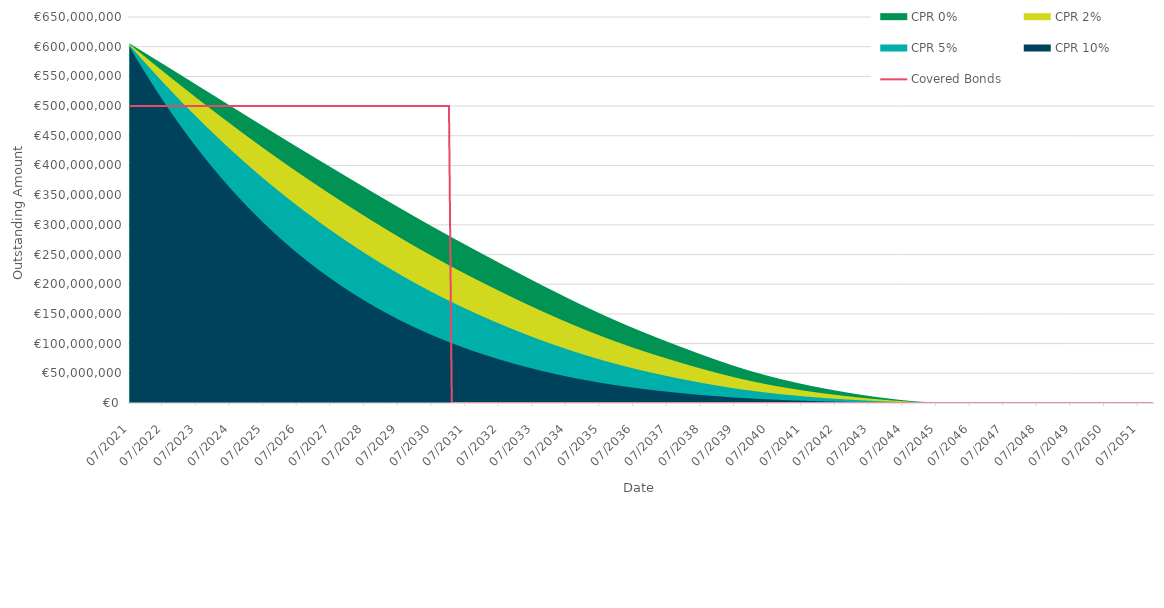
| Category | Covered Bonds |
|---|---|
| 2021-07-31 | 500000000 |
| 2021-08-31 | 500000000 |
| 2021-09-30 | 500000000 |
| 2021-10-31 | 500000000 |
| 2021-11-30 | 500000000 |
| 2021-12-31 | 500000000 |
| 2022-01-31 | 500000000 |
| 2022-02-28 | 500000000 |
| 2022-03-31 | 500000000 |
| 2022-04-30 | 500000000 |
| 2022-05-31 | 500000000 |
| 2022-06-30 | 500000000 |
| 2022-07-31 | 500000000 |
| 2022-08-31 | 500000000 |
| 2022-09-30 | 500000000 |
| 2022-10-31 | 500000000 |
| 2022-11-30 | 500000000 |
| 2022-12-31 | 500000000 |
| 2023-01-31 | 500000000 |
| 2023-02-28 | 500000000 |
| 2023-03-31 | 500000000 |
| 2023-04-30 | 500000000 |
| 2023-05-31 | 500000000 |
| 2023-06-30 | 500000000 |
| 2023-07-31 | 500000000 |
| 2023-08-31 | 500000000 |
| 2023-09-30 | 500000000 |
| 2023-10-31 | 500000000 |
| 2023-11-30 | 500000000 |
| 2023-12-31 | 500000000 |
| 2024-01-31 | 500000000 |
| 2024-02-29 | 500000000 |
| 2024-03-31 | 500000000 |
| 2024-04-30 | 500000000 |
| 2024-05-31 | 500000000 |
| 2024-06-30 | 500000000 |
| 2024-07-31 | 500000000 |
| 2024-08-31 | 500000000 |
| 2024-09-30 | 500000000 |
| 2024-10-31 | 500000000 |
| 2024-11-30 | 500000000 |
| 2024-12-31 | 500000000 |
| 2025-01-31 | 500000000 |
| 2025-02-28 | 500000000 |
| 2025-03-31 | 500000000 |
| 2025-04-30 | 500000000 |
| 2025-05-31 | 500000000 |
| 2025-06-30 | 500000000 |
| 2025-07-31 | 500000000 |
| 2025-08-31 | 500000000 |
| 2025-09-30 | 500000000 |
| 2025-10-31 | 500000000 |
| 2025-11-30 | 500000000 |
| 2025-12-31 | 500000000 |
| 2026-01-31 | 500000000 |
| 2026-02-28 | 500000000 |
| 2026-03-31 | 500000000 |
| 2026-04-30 | 500000000 |
| 2026-05-31 | 500000000 |
| 2026-06-30 | 500000000 |
| 2026-07-31 | 500000000 |
| 2026-08-31 | 500000000 |
| 2026-09-30 | 500000000 |
| 2026-10-31 | 500000000 |
| 2026-11-30 | 500000000 |
| 2026-12-31 | 500000000 |
| 2027-01-31 | 500000000 |
| 2027-02-28 | 500000000 |
| 2027-03-31 | 500000000 |
| 2027-04-30 | 500000000 |
| 2027-05-31 | 500000000 |
| 2027-06-30 | 500000000 |
| 2027-07-31 | 500000000 |
| 2027-08-31 | 500000000 |
| 2027-09-30 | 500000000 |
| 2027-10-31 | 500000000 |
| 2027-11-30 | 500000000 |
| 2027-12-31 | 500000000 |
| 2028-01-31 | 500000000 |
| 2028-02-29 | 500000000 |
| 2028-03-31 | 500000000 |
| 2028-04-30 | 500000000 |
| 2028-05-31 | 500000000 |
| 2028-06-30 | 500000000 |
| 2028-07-31 | 500000000 |
| 2028-08-31 | 500000000 |
| 2028-09-30 | 500000000 |
| 2028-10-31 | 500000000 |
| 2028-11-30 | 500000000 |
| 2028-12-31 | 500000000 |
| 2029-01-31 | 500000000 |
| 2029-02-28 | 500000000 |
| 2029-03-31 | 500000000 |
| 2029-04-30 | 500000000 |
| 2029-05-31 | 500000000 |
| 2029-06-30 | 500000000 |
| 2029-07-31 | 500000000 |
| 2029-08-31 | 500000000 |
| 2029-09-30 | 500000000 |
| 2029-10-31 | 500000000 |
| 2029-11-30 | 500000000 |
| 2029-12-31 | 500000000 |
| 2030-01-31 | 500000000 |
| 2030-02-28 | 500000000 |
| 2030-03-31 | 500000000 |
| 2030-04-30 | 500000000 |
| 2030-05-31 | 500000000 |
| 2030-06-30 | 500000000 |
| 2030-07-31 | 500000000 |
| 2030-08-31 | 500000000 |
| 2030-09-30 | 500000000 |
| 2030-10-31 | 500000000 |
| 2030-11-30 | 500000000 |
| 2030-12-31 | 500000000 |
| 2031-01-31 | 500000000 |
| 2031-02-28 | 0 |
| 2031-03-31 | 0 |
| 2031-04-30 | 0 |
| 2031-05-31 | 0 |
| 2031-06-30 | 0 |
| 2031-07-31 | 0 |
| 2031-08-31 | 0 |
| 2031-09-30 | 0 |
| 2031-10-31 | 0 |
| 2031-11-30 | 0 |
| 2031-12-31 | 0 |
| 2032-01-31 | 0 |
| 2032-02-29 | 0 |
| 2032-03-31 | 0 |
| 2032-04-30 | 0 |
| 2032-05-31 | 0 |
| 2032-06-30 | 0 |
| 2032-07-31 | 0 |
| 2032-08-31 | 0 |
| 2032-09-30 | 0 |
| 2032-10-31 | 0 |
| 2032-11-30 | 0 |
| 2032-12-31 | 0 |
| 2033-01-31 | 0 |
| 2033-02-28 | 0 |
| 2033-03-31 | 0 |
| 2033-04-30 | 0 |
| 2033-05-31 | 0 |
| 2033-06-30 | 0 |
| 2033-07-31 | 0 |
| 2033-08-31 | 0 |
| 2033-09-30 | 0 |
| 2033-10-31 | 0 |
| 2033-11-30 | 0 |
| 2033-12-31 | 0 |
| 2034-01-31 | 0 |
| 2034-02-28 | 0 |
| 2034-03-31 | 0 |
| 2034-04-30 | 0 |
| 2034-05-31 | 0 |
| 2034-06-30 | 0 |
| 2034-07-31 | 0 |
| 2034-08-31 | 0 |
| 2034-09-30 | 0 |
| 2034-10-31 | 0 |
| 2034-11-30 | 0 |
| 2034-12-31 | 0 |
| 2035-01-31 | 0 |
| 2035-02-28 | 0 |
| 2035-03-31 | 0 |
| 2035-04-30 | 0 |
| 2035-05-31 | 0 |
| 2035-06-30 | 0 |
| 2035-07-31 | 0 |
| 2035-08-31 | 0 |
| 2035-09-30 | 0 |
| 2035-10-31 | 0 |
| 2035-11-30 | 0 |
| 2035-12-31 | 0 |
| 2036-01-31 | 0 |
| 2036-02-29 | 0 |
| 2036-03-31 | 0 |
| 2036-04-30 | 0 |
| 2036-05-31 | 0 |
| 2036-06-30 | 0 |
| 2036-07-31 | 0 |
| 2036-08-31 | 0 |
| 2036-09-30 | 0 |
| 2036-10-31 | 0 |
| 2036-11-30 | 0 |
| 2036-12-31 | 0 |
| 2037-01-31 | 0 |
| 2037-02-28 | 0 |
| 2037-03-31 | 0 |
| 2037-04-30 | 0 |
| 2037-05-31 | 0 |
| 2037-06-30 | 0 |
| 2037-07-31 | 0 |
| 2037-08-31 | 0 |
| 2037-09-30 | 0 |
| 2037-10-31 | 0 |
| 2037-11-30 | 0 |
| 2037-12-31 | 0 |
| 2038-01-31 | 0 |
| 2038-02-28 | 0 |
| 2038-03-31 | 0 |
| 2038-04-30 | 0 |
| 2038-05-31 | 0 |
| 2038-06-30 | 0 |
| 2038-07-31 | 0 |
| 2038-08-31 | 0 |
| 2038-09-30 | 0 |
| 2038-10-31 | 0 |
| 2038-11-30 | 0 |
| 2038-12-31 | 0 |
| 2039-01-31 | 0 |
| 2039-02-28 | 0 |
| 2039-03-31 | 0 |
| 2039-04-30 | 0 |
| 2039-05-31 | 0 |
| 2039-06-30 | 0 |
| 2039-07-31 | 0 |
| 2039-08-31 | 0 |
| 2039-09-30 | 0 |
| 2039-10-31 | 0 |
| 2039-11-30 | 0 |
| 2039-12-31 | 0 |
| 2040-01-31 | 0 |
| 2040-02-29 | 0 |
| 2040-03-31 | 0 |
| 2040-04-30 | 0 |
| 2040-05-31 | 0 |
| 2040-06-30 | 0 |
| 2040-07-31 | 0 |
| 2040-08-31 | 0 |
| 2040-09-30 | 0 |
| 2040-10-31 | 0 |
| 2040-11-30 | 0 |
| 2040-12-31 | 0 |
| 2041-01-31 | 0 |
| 2041-02-28 | 0 |
| 2041-03-31 | 0 |
| 2041-04-30 | 0 |
| 2041-05-31 | 0 |
| 2041-06-30 | 0 |
| 2041-07-31 | 0 |
| 2041-08-31 | 0 |
| 2041-09-30 | 0 |
| 2041-10-31 | 0 |
| 2041-11-30 | 0 |
| 2041-12-31 | 0 |
| 2042-01-31 | 0 |
| 2042-02-28 | 0 |
| 2042-03-31 | 0 |
| 2042-04-30 | 0 |
| 2042-05-31 | 0 |
| 2042-06-30 | 0 |
| 2042-07-31 | 0 |
| 2042-08-31 | 0 |
| 2042-09-30 | 0 |
| 2042-10-31 | 0 |
| 2042-11-30 | 0 |
| 2042-12-31 | 0 |
| 2043-01-31 | 0 |
| 2043-02-28 | 0 |
| 2043-03-31 | 0 |
| 2043-04-30 | 0 |
| 2043-05-31 | 0 |
| 2043-06-30 | 0 |
| 2043-07-31 | 0 |
| 2043-08-31 | 0 |
| 2043-09-30 | 0 |
| 2043-10-31 | 0 |
| 2043-11-30 | 0 |
| 2043-12-31 | 0 |
| 2044-01-31 | 0 |
| 2044-02-29 | 0 |
| 2044-03-31 | 0 |
| 2044-04-30 | 0 |
| 2044-05-31 | 0 |
| 2044-06-30 | 0 |
| 2044-07-31 | 0 |
| 2044-08-31 | 0 |
| 2044-09-30 | 0 |
| 2044-10-31 | 0 |
| 2044-11-30 | 0 |
| 2044-12-31 | 0 |
| 2045-01-31 | 0 |
| 2045-02-28 | 0 |
| 2045-03-31 | 0 |
| 2045-04-30 | 0 |
| 2045-05-31 | 0 |
| 2045-06-30 | 0 |
| 2045-07-31 | 0 |
| 2045-08-31 | 0 |
| 2045-09-30 | 0 |
| 2045-10-31 | 0 |
| 2045-11-30 | 0 |
| 2045-12-31 | 0 |
| 2046-01-31 | 0 |
| 2046-02-28 | 0 |
| 2046-03-31 | 0 |
| 2046-04-30 | 0 |
| 2046-05-31 | 0 |
| 2046-06-30 | 0 |
| 2046-07-31 | 0 |
| 2046-08-31 | 0 |
| 2046-09-30 | 0 |
| 2046-10-31 | 0 |
| 2046-11-30 | 0 |
| 2046-12-31 | 0 |
| 2047-01-31 | 0 |
| 2047-02-28 | 0 |
| 2047-03-31 | 0 |
| 2047-04-30 | 0 |
| 2047-05-31 | 0 |
| 2047-06-30 | 0 |
| 2047-07-31 | 0 |
| 2047-08-31 | 0 |
| 2047-09-30 | 0 |
| 2047-10-31 | 0 |
| 2047-11-30 | 0 |
| 2047-12-31 | 0 |
| 2048-01-31 | 0 |
| 2048-02-29 | 0 |
| 2048-03-31 | 0 |
| 2048-04-30 | 0 |
| 2048-05-31 | 0 |
| 2048-06-30 | 0 |
| 2048-07-31 | 0 |
| 2048-08-31 | 0 |
| 2048-09-30 | 0 |
| 2048-10-31 | 0 |
| 2048-11-30 | 0 |
| 2048-12-31 | 0 |
| 2049-01-31 | 0 |
| 2049-02-28 | 0 |
| 2049-03-31 | 0 |
| 2049-04-30 | 0 |
| 2049-05-31 | 0 |
| 2049-06-30 | 0 |
| 2049-07-31 | 0 |
| 2049-08-31 | 0 |
| 2049-09-30 | 0 |
| 2049-10-31 | 0 |
| 2049-11-30 | 0 |
| 2049-12-31 | 0 |
| 2050-01-31 | 0 |
| 2050-02-28 | 0 |
| 2050-03-31 | 0 |
| 2050-04-30 | 0 |
| 2050-05-31 | 0 |
| 2050-06-30 | 0 |
| 2050-07-31 | 0 |
| 2050-08-31 | 0 |
| 2050-09-30 | 0 |
| 2050-10-31 | 0 |
| 2050-11-30 | 0 |
| 2050-12-31 | 0 |
| 2051-01-31 | 0 |
| 2051-02-28 | 0 |
| 2051-03-31 | 0 |
| 2051-04-30 | 0 |
| 2051-05-31 | 0 |
| 2051-06-30 | 0 |
| 2051-07-31 | 0 |
| 2051-08-31 | 0 |
| 2051-09-30 | 0 |
| 2051-10-31 | 0 |
| 2051-11-30 | 0 |
| 2051-12-31 | 0 |